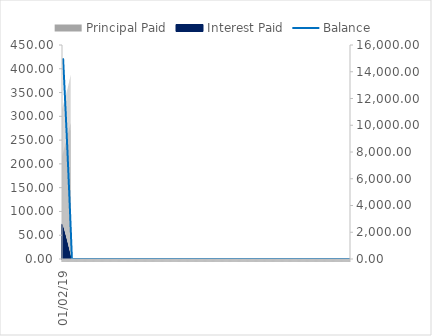
| Category | Principal Paid | Interest Paid |
|---|---|---|
| 01/02/19 | 315.871 | 73.013 |
| 01/03/19 | 217.409 | 71.476 |
| 01/04/19 | 318.467 | 70.417 |
| 01/05/19 | 220.017 | 68.867 |
| 01/06/19 | 321.088 | 67.796 |
| 01/07/19 | 222.651 | 66.233 |
| 01/08/19 | 323.735 | 65.15 |
| 01/09/19 | 225.311 | 63.574 |
| 01/10/19 | 326.408 | 62.477 |
| 01/11/19 | 227.996 | 60.888 |
| 01/12/19 | 329.106 | 59.779 |
| 01/01/20 | 230.708 | 58.177 |
| 01/02/20 | 331.831 | 57.054 |
| 01/03/20 | 233.446 | 55.438 |
| 01/04/20 | 334.583 | 54.302 |
| 01/05/20 | 236.211 | 52.674 |
| 01/06/20 | 337.361 | 51.524 |
| 01/07/20 | 239.003 | 49.882 |
| 01/08/20 | 340.166 | 48.718 |
| 01/09/20 | 241.822 | 47.063 |
| 01/10/20 | 342.999 | 45.885 |
| 01/11/20 | 244.669 | 44.216 |
| 01/12/20 | 345.86 | 43.025 |
| 01/01/21 | 247.543 | 41.341 |
| 01/02/21 | 348.748 | 40.137 |
| 01/03/21 | 250.446 | 38.439 |
| 01/04/21 | 351.665 | 37.22 |
| 01/05/21 | 253.377 | 35.508 |
| 01/06/21 | 354.61 | 34.275 |
| 01/07/21 | 256.336 | 32.549 |
| 01/08/21 | 357.584 | 31.301 |
| 01/09/21 | 259.324 | 29.56 |
| 01/10/21 | 360.587 | 28.298 |
| 01/11/21 | 262.342 | 26.543 |
| 01/12/21 | 363.619 | 25.266 |
| 01/01/22 | 265.389 | 23.496 |
| 01/02/22 | 366.68 | 22.204 |
| 01/03/22 | 268.465 | 20.42 |
| 01/04/22 | 369.772 | 19.113 |
| 01/05/22 | 271.572 | 17.313 |
| 01/06/22 | 372.894 | 15.991 |
| 01/07/22 | 274.709 | 14.176 |
| 01/08/22 | 376.046 | 12.839 |
| 01/09/22 | 277.876 | 11.008 |
| 01/10/22 | 379.229 | 9.656 |
| 01/11/22 | 281.075 | 7.81 |
| 01/12/22 | 382.443 | 6.442 |
| 01/01/23 | 284.305 | 4.58 |
| 01/02/23 | 385.688 | 3.196 |
| 01/03/23 | 270.957 | 1.319 |